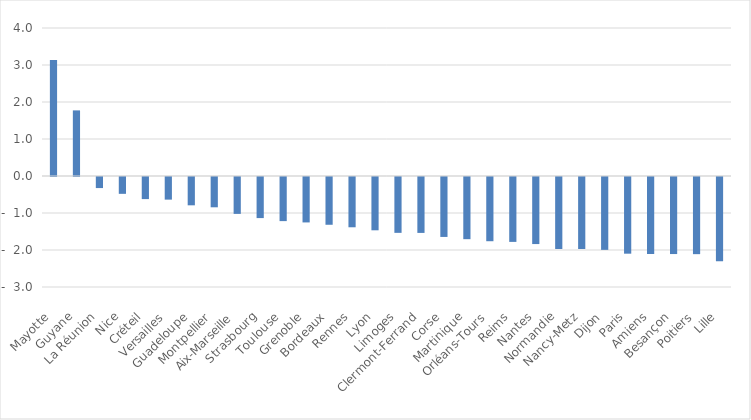
| Category | Series 0 |
|---|---|
| Mayotte | 3.135 |
| Guyane | 1.773 |
| La Réunion | -0.299 |
| Nice | -0.455 |
| Créteil | -0.597 |
| Versailles | -0.612 |
| Guadeloupe | -0.765 |
| Montpellier | -0.819 |
| Aix-Marseille | -0.997 |
| Strasbourg | -1.111 |
| Toulouse | -1.192 |
| Grenoble | -1.228 |
| Bordeaux | -1.291 |
| Rennes | -1.359 |
| Lyon | -1.44 |
| Limoges | -1.509 |
| Clermont-Ferrand | -1.511 |
| Corse | -1.62 |
| Martinique | -1.68 |
| Orléans-Tours | -1.736 |
| Reims | -1.754 |
| Nantes | -1.812 |
| Normandie | -1.945 |
| Nancy-Metz | -1.947 |
| Dijon | -1.969 |
| Paris | -2.073 |
| Amiens | -2.082 |
| Besançon | -2.082 |
| Poitiers | -2.085 |
| Lille | -2.28 |